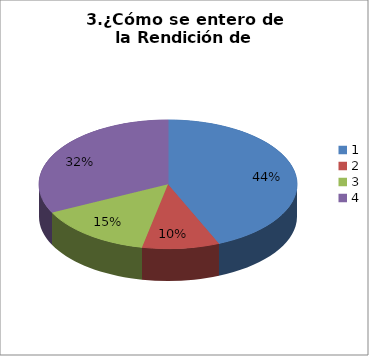
| Category | Series 0 |
|---|---|
| 0 | 27 |
| 1 | 6 |
| 2 | 9 |
| 3 | 20 |